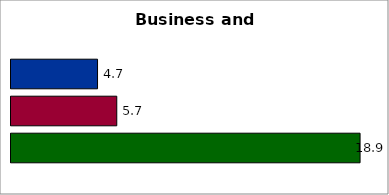
| Category | 50 states and D.C. | SREB states | State |
|---|---|---|---|
| 0 | 4.691 | 5.733 | 18.92 |